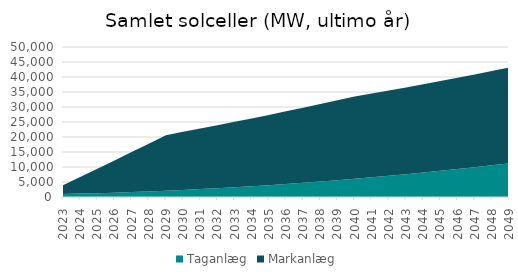
| Category | Taganlæg | Markanlæg |
|---|---|---|
| 2023.0 | 1004 | 2919 |
| 2024.0 | 1133 | 5518 |
| 2025.0 | 1284 | 8118 |
| 2026.0 | 1456 | 10718 |
| 2027.0 | 1649 | 13318 |
| 2028.0 | 1863 | 15918 |
| 2029.0 | 2098 | 18518 |
| 2030.0 | 2354 | 19407 |
| 2031.0 | 2631 | 20207 |
| 2032.0 | 2930 | 21008 |
| 2033.0 | 3250 | 21806 |
| 2034.0 | 3590 | 22607 |
| 2035.0 | 3951 | 23407 |
| 2036.0 | 4335 | 24208 |
| 2037.0 | 4738 | 25006 |
| 2038.0 | 5163 | 25807 |
| 2039.0 | 5609 | 26607 |
| 2040.0 | 6076 | 27408 |
| 2041.0 | 6565 | 27931 |
| 2042.0 | 7074 | 28433 |
| 2043.0 | 7604 | 28932 |
| 2044.0 | 8156 | 29432 |
| 2045.0 | 8728 | 29931 |
| 2046.0 | 9323 | 30433 |
| 2047.0 | 9936 | 30932 |
| 2048.0 | 10573 | 31432 |
| 2049.0 | 11230 | 31931 |